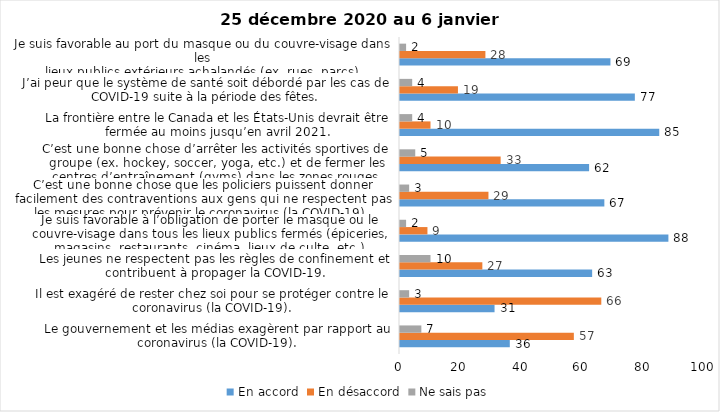
| Category | En accord | En désaccord | Ne sais pas |
|---|---|---|---|
| Le gouvernement et les médias exagèrent par rapport au coronavirus (la COVID-19). | 36 | 57 | 7 |
| Il est exagéré de rester chez soi pour se protéger contre le coronavirus (la COVID-19). | 31 | 66 | 3 |
| Les jeunes ne respectent pas les règles de confinement et contribuent à propager la COVID-19. | 63 | 27 | 10 |
| Je suis favorable à l’obligation de porter le masque ou le couvre-visage dans tous les lieux publics fermés (épiceries, magasins, restaurants, cinéma, lieux de culte, etc.). | 88 | 9 | 2 |
| C’est une bonne chose que les policiers puissent donner facilement des contraventions aux gens qui ne respectent pas les mesures pour prévenir le coronavirus (la COVID-19). | 67 | 29 | 3 |
| C’est une bonne chose d’arrêter les activités sportives de groupe (ex. hockey, soccer, yoga, etc.) et de fermer les centres d’entraînement (gyms) dans les zones rouges. | 62 | 33 | 5 |
| La frontière entre le Canada et les États-Unis devrait être fermée au moins jusqu’en avril 2021. | 85 | 10 | 4 |
| J’ai peur que le système de santé soit débordé par les cas de COVID-19 suite à la période des fêtes. | 77 | 19 | 4 |
| Je suis favorable au port du masque ou du couvre-visage dans les
lieux publics extérieurs achalandés (ex. rues, parcs) | 69 | 28 | 2 |